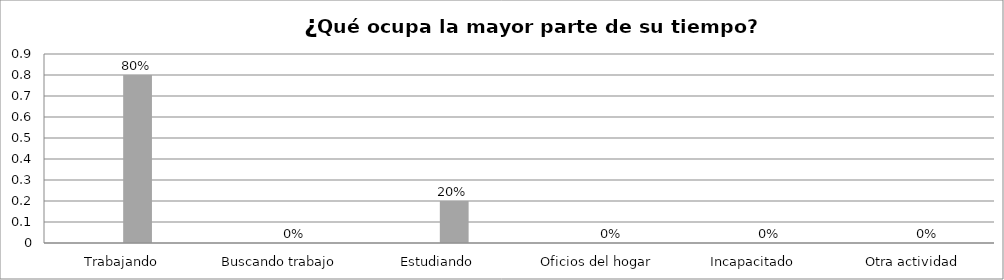
| Category | Series 0 | Series 1 | Series 2 | Series 3 |
|---|---|---|---|---|
| Trabajando |  |  | 0.8 |  |
| Buscando trabajo |  |  | 0 |  |
| Estudiando |  |  | 0.2 |  |
| Oficios del hogar |  |  | 0 |  |
| Incapacitado  |  |  | 0 |  |
| Otra actividad |  |  | 0 |  |